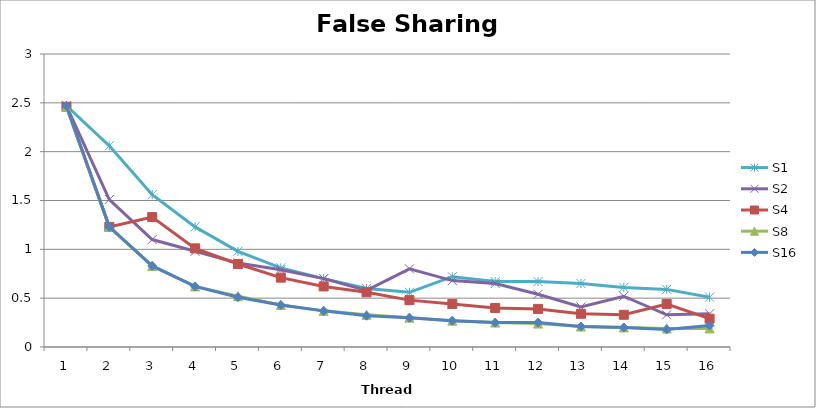
| Category | S1 | S2 | S4 | S8 | S16 |
|---|---|---|---|---|---|
| 0 | 2.47 | 2.47 | 2.46 | 2.46 | 2.47 |
| 1 | 2.06 | 1.51 | 1.23 | 1.23 | 1.23 |
| 2 | 1.56 | 1.1 | 1.33 | 0.83 | 0.83 |
| 3 | 1.23 | 0.98 | 1.01 | 0.62 | 0.62 |
| 4 | 0.98 | 0.86 | 0.85 | 0.52 | 0.51 |
| 5 | 0.81 | 0.79 | 0.71 | 0.43 | 0.43 |
| 6 | 0.7 | 0.7 | 0.62 | 0.37 | 0.37 |
| 7 | 0.6 | 0.58 | 0.56 | 0.33 | 0.32 |
| 8 | 0.56 | 0.8 | 0.48 | 0.3 | 0.3 |
| 9 | 0.72 | 0.68 | 0.44 | 0.27 | 0.27 |
| 10 | 0.67 | 0.65 | 0.4 | 0.25 | 0.25 |
| 11 | 0.67 | 0.54 | 0.39 | 0.24 | 0.25 |
| 12 | 0.65 | 0.41 | 0.34 | 0.21 | 0.21 |
| 13 | 0.61 | 0.52 | 0.33 | 0.2 | 0.2 |
| 14 | 0.59 | 0.33 | 0.44 | 0.19 | 0.18 |
| 15 | 0.51 | 0.34 | 0.29 | 0.19 | 0.22 |